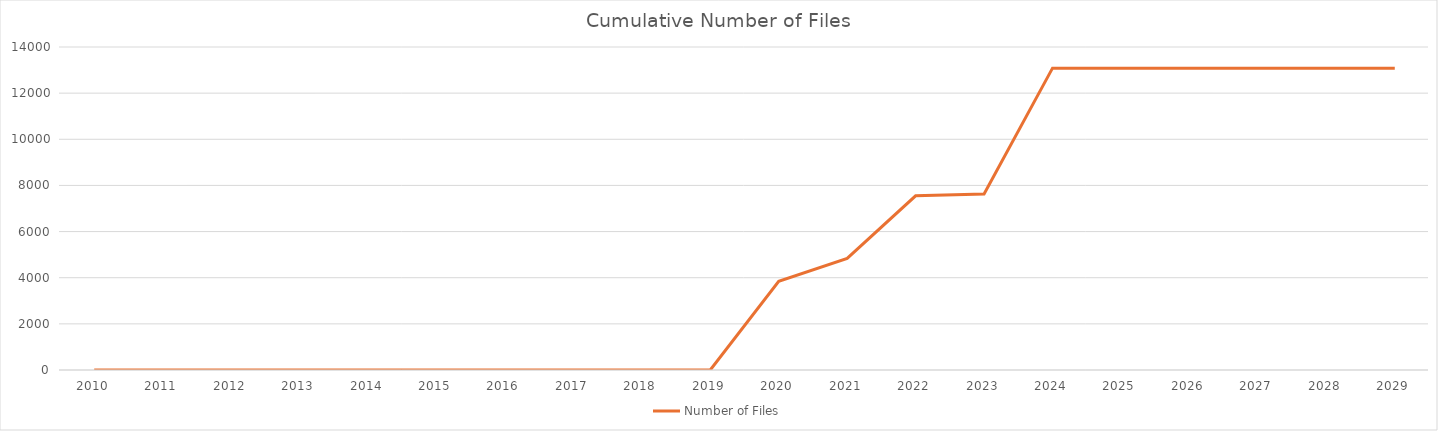
| Category | Number of Files |
|---|---|
| 2010.0 | 0 |
| 2011.0 | 0 |
| 2012.0 | 0 |
| 2013.0 | 0 |
| 2014.0 | 0 |
| 2015.0 | 0 |
| 2016.0 | 0 |
| 2017.0 | 0 |
| 2018.0 | 0 |
| 2019.0 | 0 |
| 2020.0 | 3841 |
| 2021.0 | 4839 |
| 2022.0 | 7548 |
| 2023.0 | 7626 |
| 2024.0 | 13083 |
| 2025.0 | 13083 |
| 2026.0 | 13083 |
| 2027.0 | 13083 |
| 2028.0 | 13083 |
| 2029.0 | 13083 |